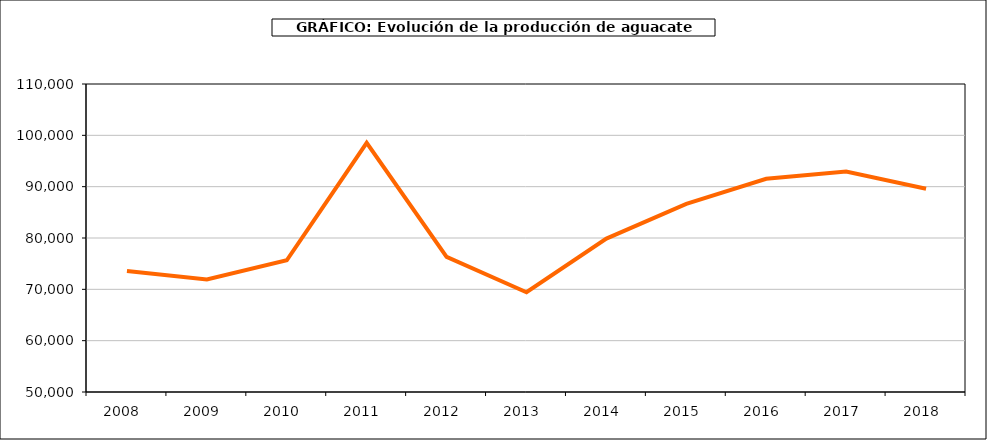
| Category | producción aguacate |
|---|---|
| 2008.0 | 73585 |
| 2009.0 | 71931 |
| 2010.0 | 75655 |
| 2011.0 | 98535 |
| 2012.0 | 76337 |
| 2013.0 | 69427 |
| 2014.0 | 79886 |
| 2015.0 | 86636 |
| 2016.0 | 91530 |
| 2017.0 | 92936 |
| 2018.0 | 89592 |